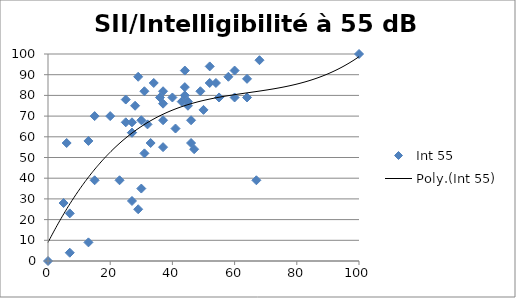
| Category | Int 55 |
|---|---|
| 0.0 | 0 |
| 5.0 | 28 |
| 6.0 | 57 |
| 7.0 | 4 |
| 7.0 | 23 |
| 13.0 | 58 |
| 13.0 | 9 |
| 15.0 | 70 |
| 15.0 | 39 |
| 20.0 | 70 |
| 23.0 | 39 |
| 25.0 | 67 |
| 25.0 | 78 |
| 27.0 | 62 |
| 27.0 | 62 |
| 27.0 | 67 |
| 27.0 | 29 |
| 28.0 | 75 |
| 29.0 | 25 |
| 29.0 | 89 |
| 30.0 | 68 |
| 30.0 | 35 |
| 31.0 | 52 |
| 31.0 | 82 |
| 32.0 | 66 |
| 33.0 | 57 |
| 34.0 | 86 |
| 36.0 | 79 |
| 37.0 | 76 |
| 37.0 | 68 |
| 37.0 | 55 |
| 37.0 | 82 |
| 40.0 | 79 |
| 41.0 | 64 |
| 43.0 | 77 |
| 44.0 | 84 |
| 44.0 | 80 |
| 44.0 | 92 |
| 45.0 | 75 |
| 45.0 | 77 |
| 46.0 | 57 |
| 46.0 | 68 |
| 47.0 | 54 |
| 49.0 | 82 |
| 50.0 | 73 |
| 52.0 | 86 |
| 52.0 | 94 |
| 54.0 | 86 |
| 55.0 | 79 |
| 55.0 | 79 |
| 58.0 | 89 |
| 60.0 | 92 |
| 60.0 | 79 |
| 64.0 | 79 |
| 64.0 | 88 |
| 67.0 | 39 |
| 68.0 | 97 |
| 100.0 | 100 |